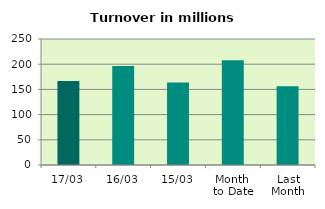
| Category | Series 0 |
|---|---|
| 17/03 | 166.746 |
| 16/03 | 196.554 |
| 15/03 | 163.688 |
| Month 
to Date | 207.755 |
| Last
Month | 156.222 |